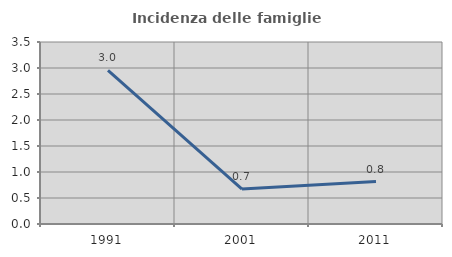
| Category | Incidenza delle famiglie numerose |
|---|---|
| 1991.0 | 2.956 |
| 2001.0 | 0.672 |
| 2011.0 | 0.817 |